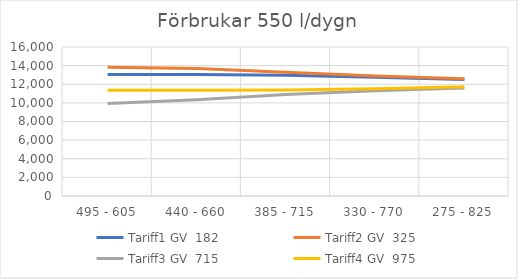
| Category | Tariff1 GV  | Tariff2 GV  | Tariff3 GV  | Tariff4 GV  |
|---|---|---|---|---|
| 495 - 605 | 13041.45 | 13824.375 | 9945.255 | 11360.625 |
| 440 - 660 | 13039.041 | 13702.841 | 10339.488 | 11360.986 |
| 385 - 715 | 12963.94 | 13300.899 | 10892.655 | 11390.376 |
| 330 - 770 | 12755.622 | 12897.753 | 11302.004 | 11522.028 |
| 275 - 825 | 12498.702 | 12583.078 | 11588.796 | 11725.408 |